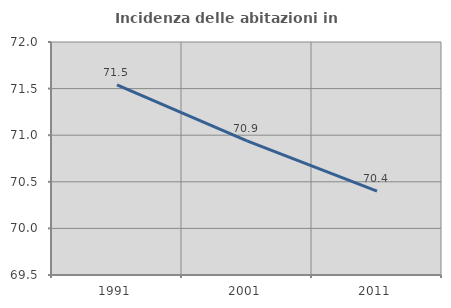
| Category | Incidenza delle abitazioni in proprietà  |
|---|---|
| 1991.0 | 71.54 |
| 2001.0 | 70.94 |
| 2011.0 | 70.399 |